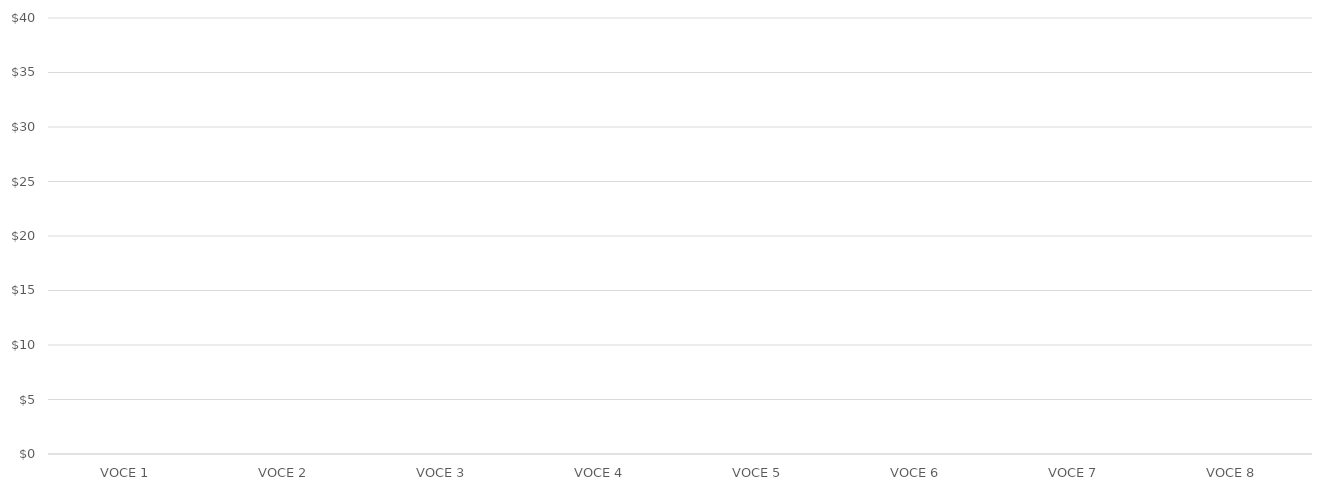
| Category | PROFITTO PER VOCE |
|---|---|
| VOCE 1 | 0 |
| VOCE 2 | 0 |
| VOCE 3 | 0 |
| VOCE 4 | 0 |
| VOCE 5 | 0 |
| VOCE 6 | 0 |
| VOCE 7 | 0 |
| VOCE 8 | 0 |